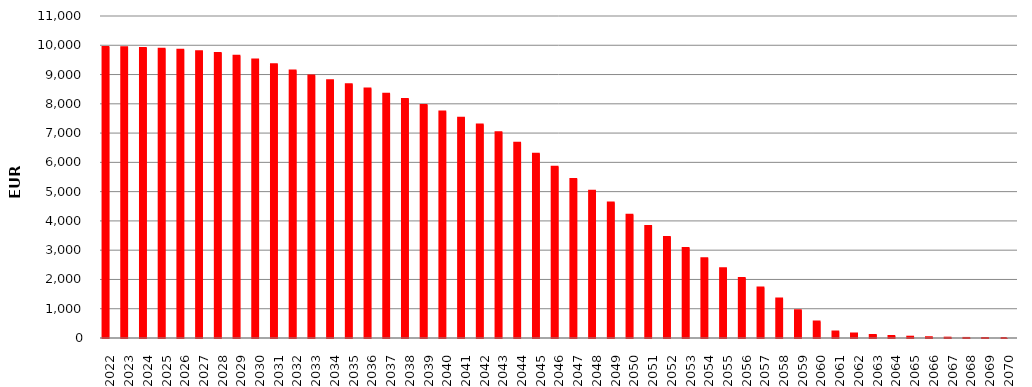
| Category |  9.950.092.445,53    |  SumOfMont Cred Ced act  |
|---|---|---|
| 2022 | 9945052909.15 | 5039536.38 |
| 2023 | 9930488827.45 | 14564081.7 |
| 2024 | 9907400988.44 | 23087839.01 |
| 2025 | 9880449422.12 | 26951566.32 |
| 2026 | 9845966848.14 | 34482573.98 |
| 2027 | 9799255882.33 | 46710965.81 |
| 2028 | 9739420959.96 | 59834922.37 |
| 2029 | 9642052824.69 | 97368135.27 |
| 2030 | 9515922295.74 | 126130528.95 |
| 2031 | 9355196041.86 | 160726253.88 |
| 2032 | 9138309419.54 | 216886622.32 |
| 2033 | 8964102541.68 | 174206877.86 |
| 2034 | 8805247399.92 | 158855141.76 |
| 2035 | 8668423172.94 | 136824226.98 |
| 2036 | 8521814628.85 | 146608544.09 |
| 2037 | 8346245634.08 | 175568994.77 |
| 2038 | 8166042467.17 | 180203166.91 |
| 2039 | 7963337085.05 | 202705382.12 |
| 2040 | 7740704566.26 | 222632518.79 |
| 2041 | 7525250499.75 | 215454066.51 |
| 2042 | 7295390061.44 | 229860438.31 |
| 2043 | 7024569644.09 | 270820417.35 |
| 2044 | 6668982522.22 | 355587121.87 |
| 2045 | 6293083915.1 | 375898607.12 |
| 2046 | 5854091392.15 | 438992522.95 |
| 2047 | 5427646400.81 | 426444991.34 |
| 2048 | 5027501448.91 | 400144951.9 |
| 2049 | 4628928910.86 | 398572538.05 |
| 2050 | 4211203672.88 | 417725237.98 |
| 2051 | 3823269382.9 | 387934289.98 |
| 2052 | 3447474605.73 | 375794777.17 |
| 2053 | 3074174820.41 | 373299785.32 |
| 2054 | 2723415010.15 | 350759810.26 |
| 2055 | 2380000540.53 | 343414469.62 |
| 2056 | 2047587504.6 | 332413035.93 |
| 2057 | 1722993023.44 | 324594481.16 |
| 2058 | 1346552986.59 | 376440036.85 |
| 2059 | 945933448.49 | 400619538.1 |
| 2060 | 560363130.6 | 385570317.89 |
| 2061 | 218378386.57 | 341984744.03 |
| 2062 | 153424977.38 | 64953409.19 |
| 2063 | 103538987.29 | 49885990.09 |
| 2064 | 71058391.49 | 32480595.8 |
| 2065 | 44361550.4 | 26696841.09 |
| 2066 | 25940487.51 | 18421062.89 |
| 2067 | 11457883.11 | 14482604.4 |
| 2068 | 2075959.78 | 9381923.33 |
| 2069 | 357392.4 | 1718567.38 |
| 2070 | 0 | 357392.4 |